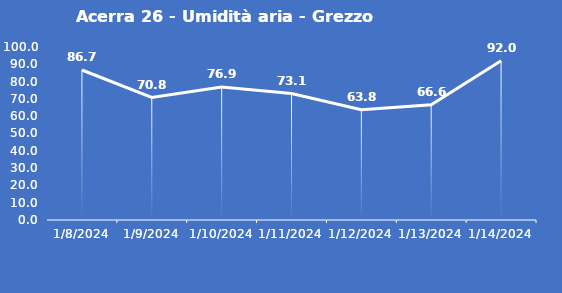
| Category | Acerra 26 - Umidità aria - Grezzo (%) |
|---|---|
| 1/8/24 | 86.7 |
| 1/9/24 | 70.8 |
| 1/10/24 | 76.9 |
| 1/11/24 | 73.1 |
| 1/12/24 | 63.8 |
| 1/13/24 | 66.6 |
| 1/14/24 | 92 |